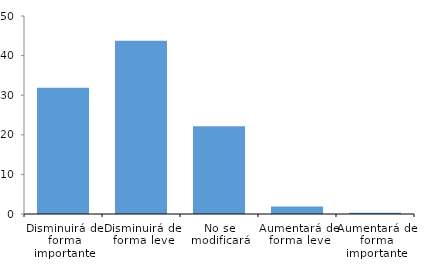
| Category | Respuestas |
|---|---|
| 0 | 31.875 |
| 1 | 43.75 |
| 2 | 22.188 |
| 3 | 1.875 |
| 4 | 0.312 |